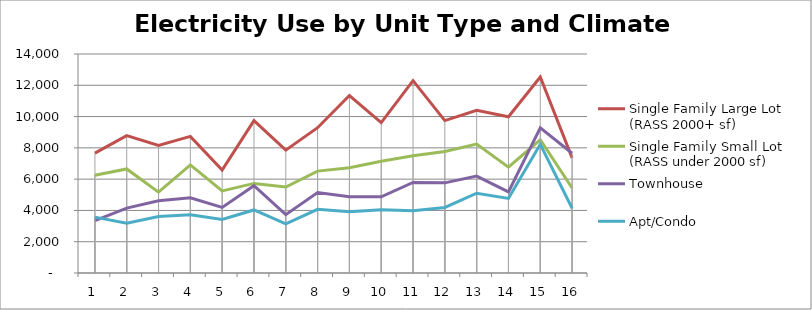
| Category | Single Family Large Lot
(RASS 2000+ sf) | Single Family Small Lot
(RASS under 2000 sf) | Townhouse | Apt/Condo |
|---|---|---|---|---|
| 1.0 | 7665 | 6245 | 3344 | 3573 |
| 2.0 | 8783 | 6652 | 4145 | 3186 |
| 3.0 | 8161 | 5166 | 4612 | 3606 |
| 4.0 | 8735 | 6911 | 4807 | 3730 |
| 5.0 | 6576 | 5249 | 4189 | 3423 |
| 6.0 | 9742 | 5727 | 5578 | 4030 |
| 7.0 | 7852 | 5499 | 3732 | 3134 |
| 8.0 | 9287 | 6513 | 5148 | 4068 |
| 9.0 | 11343 | 6723 | 4873 | 3908 |
| 10.0 | 9618 | 7148 | 4873 | 4042 |
| 11.0 | 12297 | 7490 | 5787 | 3974 |
| 12.0 | 9742 | 7767 | 5762 | 4190 |
| 13.0 | 10406 | 8237 | 6198 | 5101 |
| 14.0 | 9988 | 6768 | 5186 | 4771 |
| 15.0 | 12529 | 8516 | 9275 | 8229 |
| 16.0 | 7361 | 5434 | 7653 | 4142 |